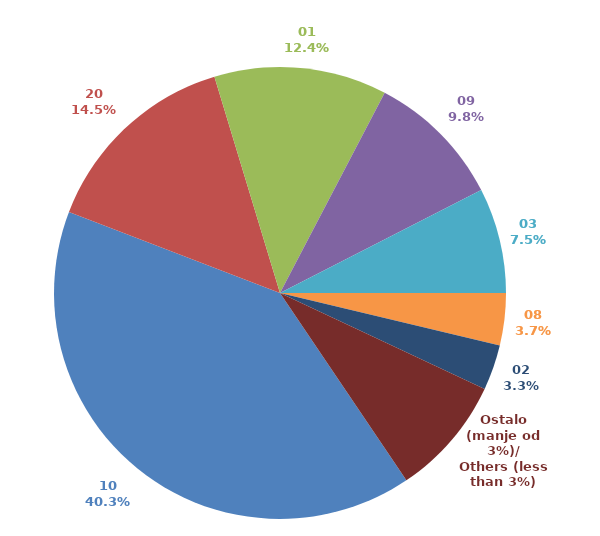
| Category | Series 0 |
|---|---|
| 10 | 0.403 |
| 20 | 0.145 |
| 01 | 0.124 |
| 09 | 0.098 |
| 03 | 0.075 |
| 08 | 0.037 |
| 02 | 0.032 |
| Ostalo (manje od 3%)/
Others (less than 3%) | 0.086 |